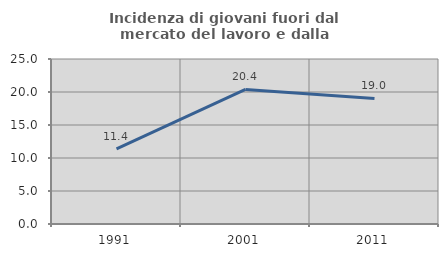
| Category | Incidenza di giovani fuori dal mercato del lavoro e dalla formazione  |
|---|---|
| 1991.0 | 11.375 |
| 2001.0 | 20.39 |
| 2011.0 | 19.026 |